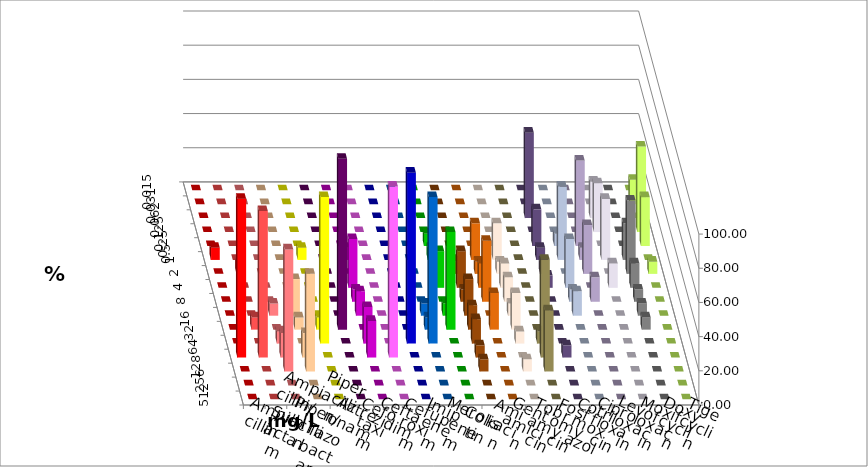
| Category | Ampicillin | Ampicillin/ Sulbactam | Piperacillin | Piperacillin/ Tazobactam | Aztreonam | Cefotaxim | Ceftazidim | Cefuroxim | Imipenem | Meropenem | Colistin | Amikacin | Gentamicin | Tobramycin | Fosfomycin | Cotrimoxazol | Ciprofloxacin | Levofloxacin | Moxifloxacin | Doxycyclin | Tigecyclin |
|---|---|---|---|---|---|---|---|---|---|---|---|---|---|---|---|---|---|---|---|---|---|
| 0.015 | 0 | 0 | 0 | 0 | 0 | 0 | 0 | 0 | 0 | 0 | 0 | 0 | 0 | 0 | 0 | 0 | 0 | 0 | 0 | 0 | 0 |
| 0.031 | 0 | 0 | 0 | 0 | 0 | 0 | 0 | 0 | 0 | 0 | 0 | 0 | 0 | 0 | 0 | 0 | 0 | 0 | 0 | 0 | 14.286 |
| 0.062 | 0 | 0 | 0 | 0 | 0 | 0 | 0 | 0 | 0 | 0 | 0 | 0 | 0 | 0 | 0 | 50 | 0 | 0 | 21.429 | 0 | 0 |
| 0.125 | 0 | 0 | 0 | 0 | 0 | 0 | 0 | 0 | 0 | 0 | 0 | 0 | 0 | 0 | 0 | 0 | 0 | 0 | 28.571 | 0 | 50 |
| 0.25 | 0 | 0 | 0 | 0 | 0 | 0 | 0 | 0 | 0 | 0 | 7.143 | 0 | 0 | 0 | 0 | 21.429 | 7.143 | 50 | 0 | 0 | 28.571 |
| 0.5 | 7.143 | 0 | 0 | 0 | 7.143 | 0 | 7.143 | 0 | 0 | 0 | 7.143 | 0 | 21.429 | 21.429 | 0 | 7.143 | 42.857 | 7.143 | 35.714 | 21.429 | 0 |
| 1.0 | 0 | 7.143 | 0 | 0 | 0 | 0 | 0 | 0 | 0 | 0 | 0 | 7.143 | 7.143 | 7.143 | 0 | 7.143 | 0 | 28.571 | 0 | 42.857 | 7.143 |
| 2.0 | 0 | 0 | 0 | 0 | 0 | 0 | 28.571 | 0 | 0 | 0 | 21.429 | 21.429 | 14.286 | 14.286 | 0 | 7.143 | 28.571 | 0 | 14.286 | 14.286 | 0 |
| 4.0 | 0 | 0 | 0 | 0 | 0 | 0 | 7.143 | 0 | 0 | 0 | 0 | 7.143 | 35.714 | 14.286 | 0 | 0 | 7.143 | 14.286 | 0 | 7.143 | 0 |
| 8.0 | 0 | 0 | 7.143 | 21.429 | 0 | 0 | 14.286 | 0 | 0 | 7.143 | 7.143 | 21.429 | 0 | 7.143 | 0 | 0 | 14.286 | 0 | 0 | 7.143 | 0 |
| 16.0 | 0 | 7.143 | 0 | 7.143 | 7.143 | 100 | 0 | 0 | 0 | 7.143 | 57.143 | 14.286 | 21.429 | 21.429 | 0 | 0 | 0 | 0 | 0 | 7.143 | 0 |
| 32.0 | 0 | 0 | 7.143 | 0 | 85.714 | 0 | 21.429 | 0 | 100 | 85.714 | 0 | 14.286 | 0 | 7.143 | 7.143 | 0 | 0 | 0 | 0 | 0 | 0 |
| 64.0 | 92.857 | 85.714 | 14.286 | 14.286 | 0 | 0 | 21.429 | 100 | 0 | 0 | 0 | 7.143 | 0 | 0 | 57.143 | 7.143 | 0 | 0 | 0 | 0 | 0 |
| 128.0 | 0 | 0 | 71.429 | 57.143 | 0 | 0 | 0 | 0 | 0 | 0 | 0 | 7.143 | 0 | 7.143 | 35.714 | 0 | 0 | 0 | 0 | 0 | 0 |
| 256.0 | 0 | 0 | 0 | 0 | 0 | 0 | 0 | 0 | 0 | 0 | 0 | 0 | 0 | 0 | 0 | 0 | 0 | 0 | 0 | 0 | 0 |
| 512.0 | 0 | 0 | 0 | 0 | 0 | 0 | 0 | 0 | 0 | 0 | 0 | 0 | 0 | 0 | 0 | 0 | 0 | 0 | 0 | 0 | 0 |